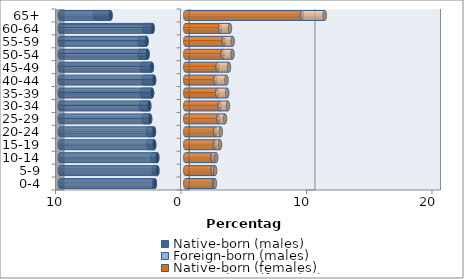
| Category | Native-born (males) | Foreign-born (males) | Native-born (females) | Foreign-born (females) |
|---|---|---|---|---|
| 0-4 | -2.426 | -0.074 | 2.297 | 0.067 |
| 5-9 | -2.223 | -0.29 | 2.193 | 0.19 |
| 10-14 | -2.229 | -0.369 | 2.177 | 0.292 |
| 15-19 | -2.473 | -0.442 | 2.359 | 0.415 |
| 20-24 | -2.495 | -0.464 | 2.369 | 0.467 |
| 25-29 | -2.8 | -0.493 | 2.644 | 0.524 |
| 30-34 | -2.87 | -0.667 | 2.745 | 0.658 |
| 35-39 | -2.645 | -0.803 | 2.545 | 0.802 |
| 40-44 | -2.485 | -0.837 | 2.375 | 0.915 |
| 45-49 | -2.657 | -0.778 | 2.58 | 0.906 |
| 50-54 | -3.004 | -0.635 | 2.974 | 0.795 |
| 55-59 | -3.086 | -0.553 | 3.074 | 0.709 |
| 60-64 | -2.6 | -0.67 | 2.774 | 0.792 |
| 65+ | -5.955 | -1.222 | 9.301 | 1.817 |